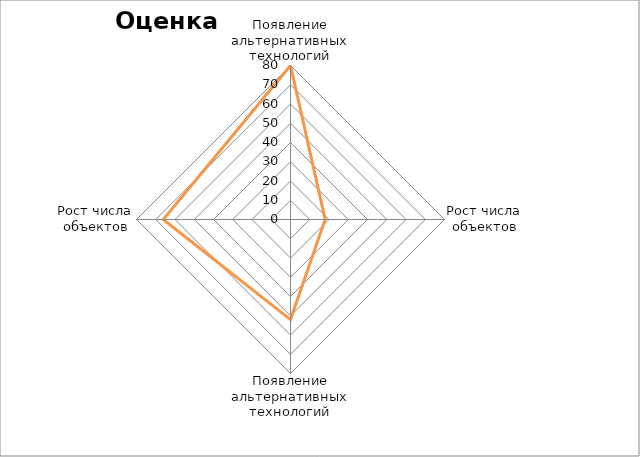
| Category | Оценка U |
|---|---|
| Появление альтернативных технологий | 80 |
| Рост числа объектов | 18 |
| Появление альтернативных технологий | 52 |
| Рост числа объектов | 66.12 |